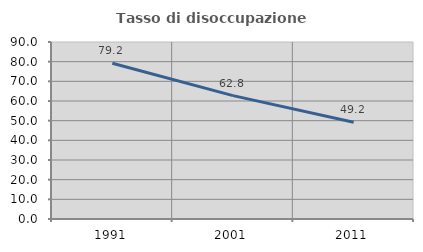
| Category | Tasso di disoccupazione giovanile  |
|---|---|
| 1991.0 | 79.19 |
| 2001.0 | 62.75 |
| 2011.0 | 49.201 |